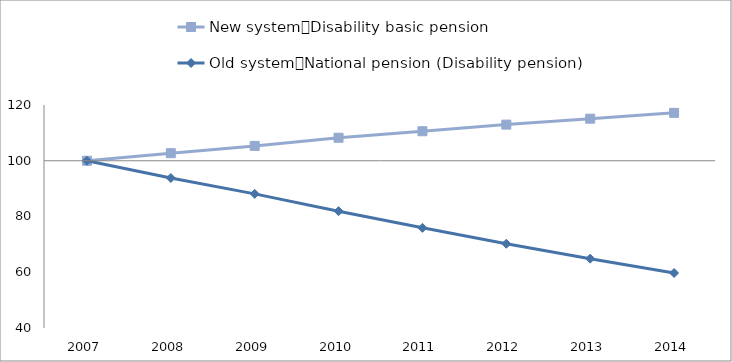
| Category | New system：Disability basic pension | Old system：National pension (Disability pension) | 0 |
|---|---|---|---|
| 2007.0 | 100 | 100 |  |
| 2008.0 | 102.71 | 93.798 |  |
| 2009.0 | 105.327 | 88.121 |  |
| 2010.0 | 108.26 | 81.916 |  |
| 2011.0 | 110.589 | 75.934 |  |
| 2012.0 | 112.963 | 70.229 |  |
| 2013.0 | 115.086 | 64.879 |  |
| 2014.0 | 117.177 | 59.731 |  |